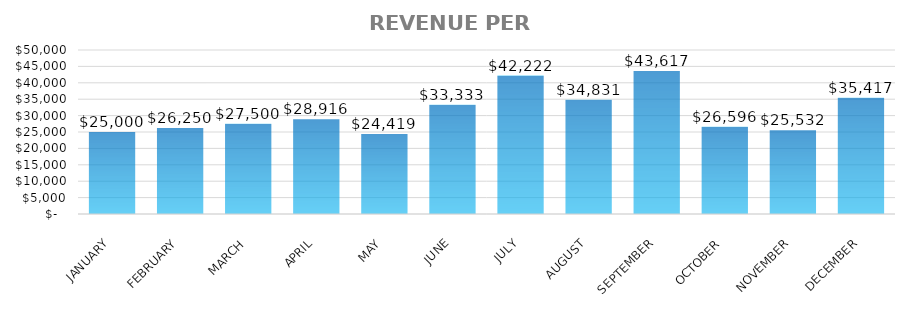
| Category | REVENUE PER EMPLOYEE |
|---|---|
| JANUARY | 25000 |
| FEBRUARY | 26250 |
| MARCH | 27500 |
| APRIL | 28915.663 |
| MAY | 24418.605 |
| JUNE | 33333.333 |
| JULY | 42222.222 |
| AUGUST | 34831.461 |
| SEPTEMBER | 43617.021 |
| OCTOBER | 26595.745 |
| NOVEMBER | 25531.915 |
| DECEMBER | 35416.667 |